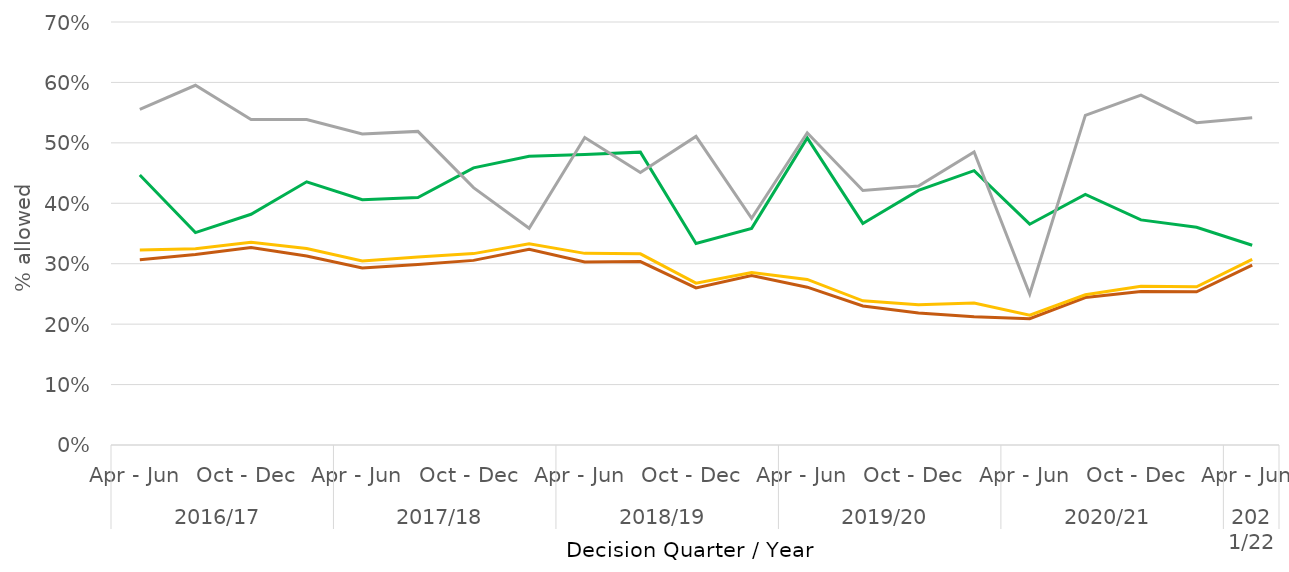
| Category | Written Representations | Hearings | Inquiries | All |
|---|---|---|---|---|
| 0 | 0.307 | 0.447 | 0.556 | 0.323 |
| 1 | 0.315 | 0.352 | 0.595 | 0.325 |
| 2 | 0.327 | 0.382 | 0.538 | 0.335 |
| 3 | 0.313 | 0.436 | 0.538 | 0.325 |
| 4 | 0.293 | 0.406 | 0.515 | 0.305 |
| 5 | 0.299 | 0.409 | 0.519 | 0.311 |
| 6 | 0.306 | 0.459 | 0.426 | 0.317 |
| 7 | 0.324 | 0.478 | 0.359 | 0.333 |
| 8 | 0.303 | 0.481 | 0.509 | 0.317 |
| 9 | 0.304 | 0.485 | 0.451 | 0.316 |
| 10 | 0.26 | 0.333 | 0.511 | 0.268 |
| 11 | 0.28 | 0.358 | 0.375 | 0.286 |
| 12 | 0.261 | 0.508 | 0.517 | 0.274 |
| 13 | 0.23 | 0.367 | 0.421 | 0.239 |
| 14 | 0.218 | 0.421 | 0.429 | 0.232 |
| 15 | 0.212 | 0.454 | 0.485 | 0.235 |
| 16 | 0.209 | 0.365 | 0.25 | 0.215 |
| 17 | 0.244 | 0.415 | 0.545 | 0.249 |
| 18 | 0.254 | 0.373 | 0.579 | 0.262 |
| 19 | 0.254 | 0.36 | 0.533 | 0.262 |
| 20 | 0.298 | 0.331 | 0.542 | 0.307 |